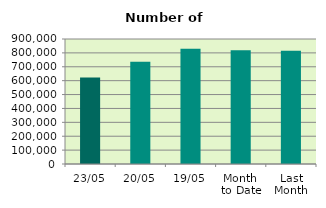
| Category | Series 0 |
|---|---|
| 23/05 | 622924 |
| 20/05 | 735328 |
| 19/05 | 829620 |
| Month 
to Date | 818808 |
| Last
Month | 814883.684 |